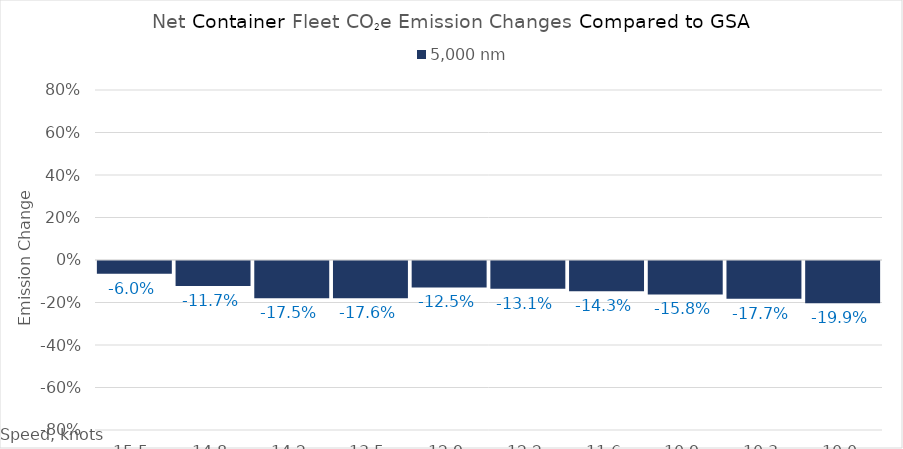
| Category | 5,000 |
|---|---|
| 15.450000000000001 | -0.06 |
| 14.8 | -0.117 |
| 14.15 | -0.175 |
| 13.5 | -0.176 |
| 12.85 | -0.125 |
| 12.2 | -0.131 |
| 11.549999999999999 | -0.143 |
| 10.899999999999999 | -0.158 |
| 10.249999999999998 | -0.177 |
| 10.0 | -0.199 |